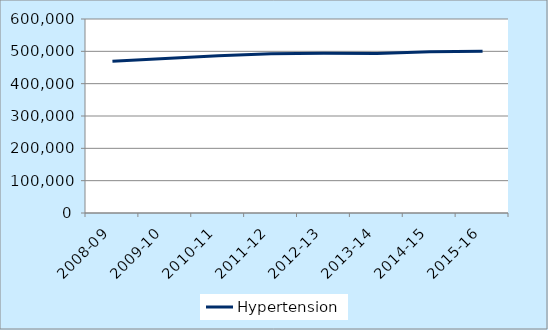
| Category | Hypertension |
|---|---|
| 2008-09 | 469518 |
| 2009-10 | 478067 |
| 2010-11 | 486533 |
| 2011-12 | 492386 |
| 2012-13 | 493981 |
| 2013-14 | 493103 |
| 2014-15 | 498553 |
| 2015-16 | 500538 |